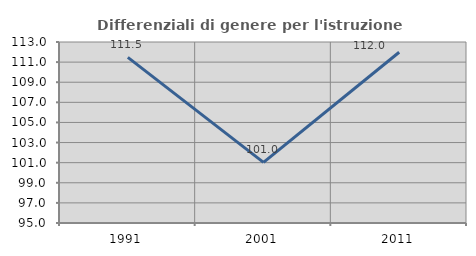
| Category | Differenziali di genere per l'istruzione superiore |
|---|---|
| 1991.0 | 111.466 |
| 2001.0 | 101.026 |
| 2011.0 | 111.983 |